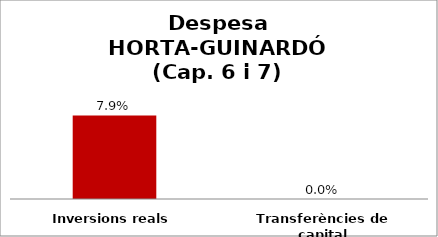
| Category | Series 0 |
|---|---|
| Inversions reals | 0.079 |
| Transferències de capital | 0 |